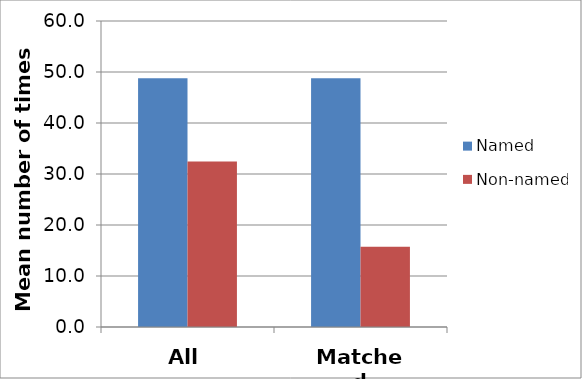
| Category | Named | Non-named |
|---|---|---|
| All | 48.764 | 32.45 |
| Matched | 48.764 | 15.747 |